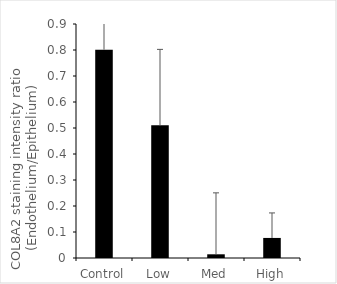
| Category | With normalization |
|---|---|
| Control | 0.801 |
| Low | 0.511 |
| Med | 0.014 |
| High | 0.077 |